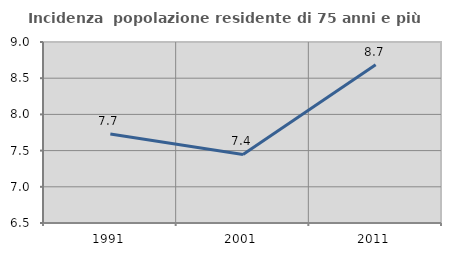
| Category | Incidenza  popolazione residente di 75 anni e più |
|---|---|
| 1991.0 | 7.73 |
| 2001.0 | 7.447 |
| 2011.0 | 8.687 |